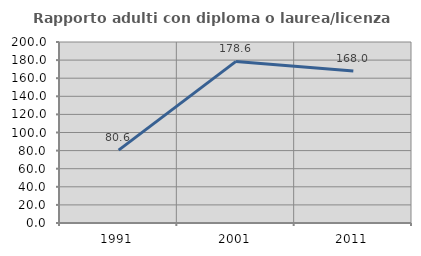
| Category | Rapporto adulti con diploma o laurea/licenza media  |
|---|---|
| 1991.0 | 80.556 |
| 2001.0 | 178.571 |
| 2011.0 | 168 |